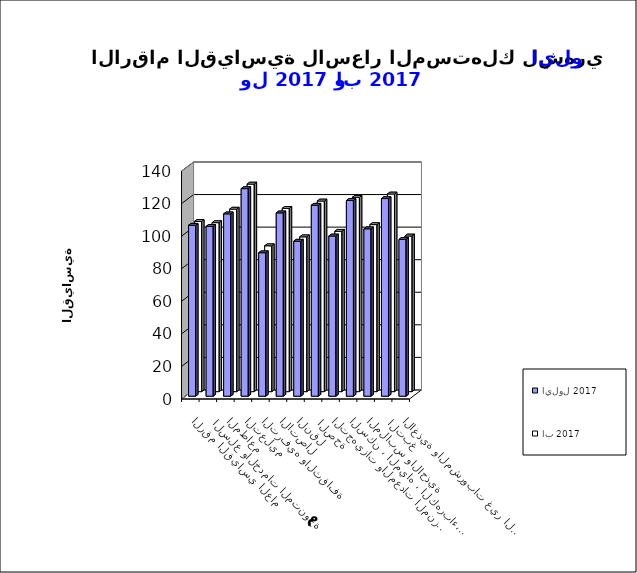
| Category | ايلول 2017      | اب 2017       |
|---|---|---|
| الاغذية والمشروبات غير الكحولية | 96.3 | 95.6 |
|  التبغ | 121.4 | 121.4 |
| الملابس والاحذية | 102.8 | 102.6 |
| السكن ، المياه ، الكهرباء، الغاز  | 120.2 | 119.4 |
| التجهيزات والمعدات المنزلية والصيانة | 98.4 | 98.5 |
|  الصحة | 117.3 | 117.1 |
| النقل | 95.2 | 95.1 |
| الاتصال | 112.6 | 112.6 |
| الترفيه والثقافة | 88.1 | 89.6 |
| التعليم | 127.5 | 127.5 |
| المطاعم  | 112 | 112.1 |
|  السلع والخدمات المتنوعة | 104.3 | 103.8 |
| الرقم القياسي العام | 105 | 104.6 |